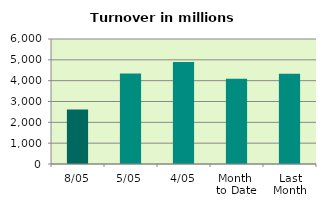
| Category | Series 0 |
|---|---|
| 8/05 | 2619.775 |
| 5/05 | 4344.781 |
| 4/05 | 4897.019 |
| Month 
to Date | 4092.286 |
| Last
Month | 4332.281 |